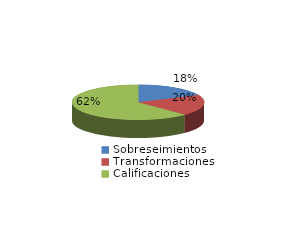
| Category | Series 0 |
|---|---|
| Sobreseimientos | 1155 |
| Transformaciones | 1261 |
| Calificaciones | 4000 |